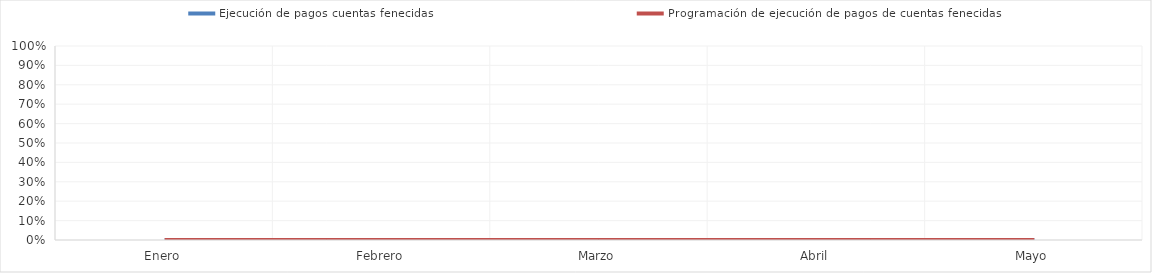
| Category | Ejecución de pagos cuentas fenecidas | Programación de ejecución de pagos de cuentas fenecidas |
|---|---|---|
| 0 | 0 | 0 |
| 1 | 0 | 0 |
| 2 | 0 | 0 |
| 3 | 0 | 0 |
| 4 | 0 | 0 |